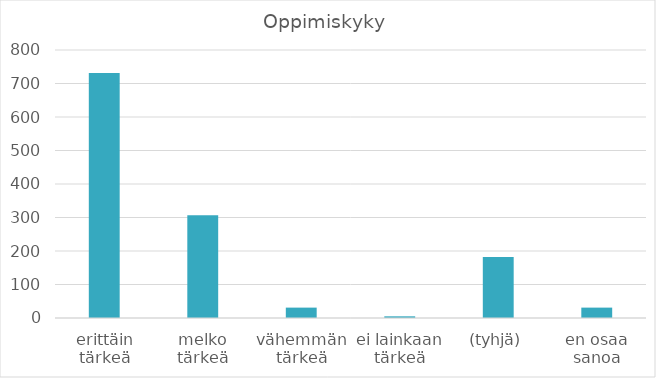
| Category | Summa |
|---|---|
| erittäin tärkeä | 731 |
| melko tärkeä | 307 |
| vähemmän tärkeä | 31 |
| ei lainkaan tärkeä | 5 |
| (tyhjä) | 182 |
| en osaa sanoa | 31 |